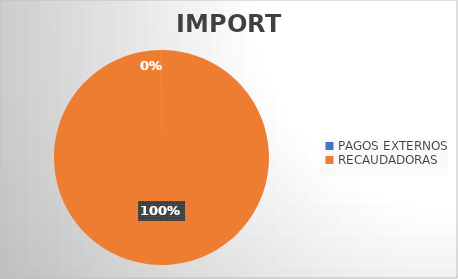
| Category | IMPORTE |
|---|---|
| PAGOS EXTERNOS | 412594.65 |
| RECAUDADORAS | 1010769947.11 |